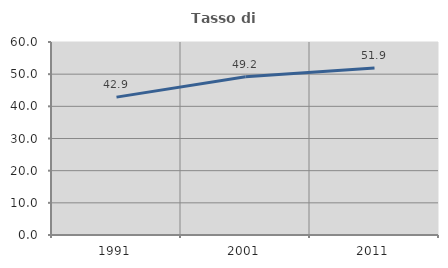
| Category | Tasso di occupazione   |
|---|---|
| 1991.0 | 42.857 |
| 2001.0 | 49.174 |
| 2011.0 | 51.894 |